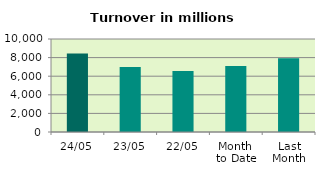
| Category | Series 0 |
|---|---|
| 24/05 | 8451.685 |
| 23/05 | 6985.546 |
| 22/05 | 6566.937 |
| Month 
to Date | 7105.82 |
| Last
Month | 7939.051 |